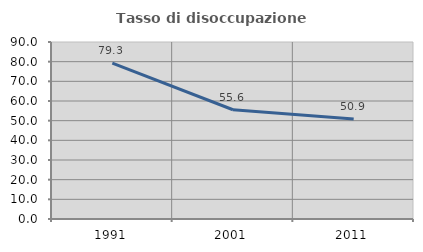
| Category | Tasso di disoccupazione giovanile  |
|---|---|
| 1991.0 | 79.279 |
| 2001.0 | 55.556 |
| 2011.0 | 50.877 |